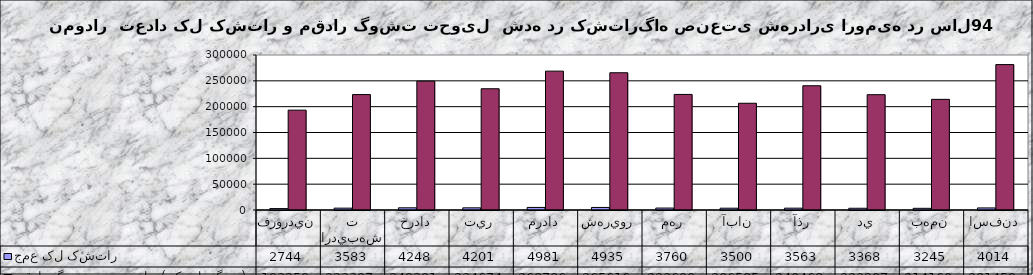
| Category | جمع کل کشتار | مقدار گوشت تحويلی ( کيلو گرم ) |
|---|---|---|
| فروردين | 2744 | 193259 |
| ارديبهشت | 3583 | 223397 |
| خرداد | 4248 | 249391 |
| تير | 4201 | 234674 |
| مرداد | 4981 | 268786 |
| شهريور | 4935 | 265616 |
| مهر | 3760 | 223690 |
| آبان | 3500 | 206585 |
| آذر | 3563 | 240468 |
| دي | 3368 | 223207 |
| بهمن | 3245 | 214160 |
| اسفند | 4014 | 281459 |